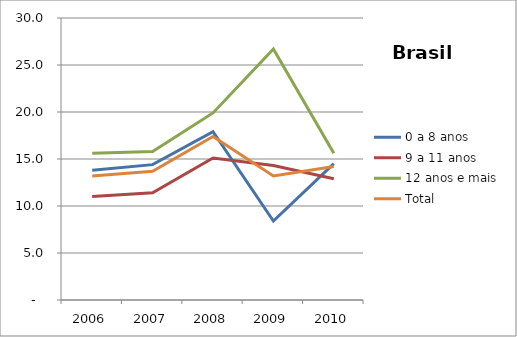
| Category | 0 a 8 anos | 9 a 11 anos | 12 anos e mais | Total |
|---|---|---|---|---|
| 2006.0 | 13.8 | 11 | 15.6 | 13.2 |
| 2007.0 | 14.4 | 11.4 | 15.8 | 13.7 |
| 2008.0 | 17.9 | 15.1 | 19.9 | 17.4 |
| 2009.0 | 8.4 | 14.3 | 26.7 | 13.2 |
| 2010.0 | 14.5 | 12.9 | 15.6 | 14.2 |